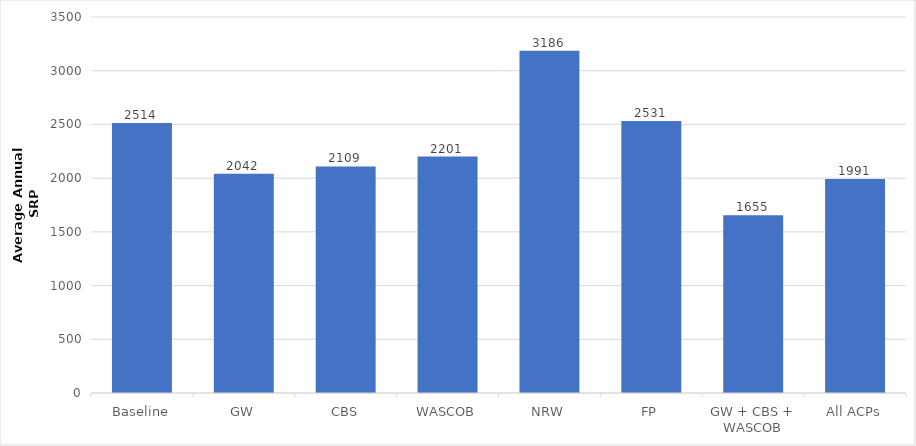
| Category | Average Annual SRP Load (kg) |
|---|---|
| Baseline | 2514.351 |
| GW | 2041.9 |
| CBS | 2108.77 |
| WASCOB | 2200.938 |
| NRW | 3186.27 |
| FP | 2531.216 |
| GW + CBS + WASCOB | 1655.354 |
| All ACPs | 1991.227 |